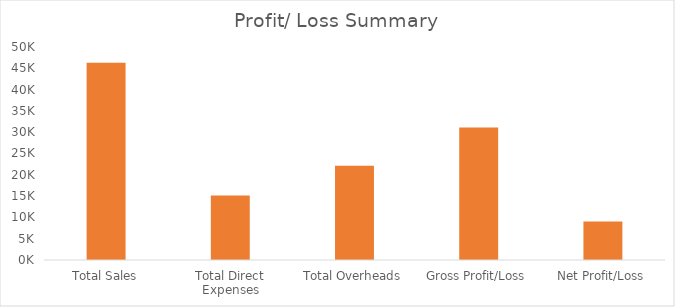
| Category | Series 0 |
|---|---|
| Total Sales | 46300 |
| Total Direct Expenses | 15170 |
| Total Overheads | 22105 |
| Gross Profit/Loss | 31130 |
| Net Profit/Loss | 9025 |